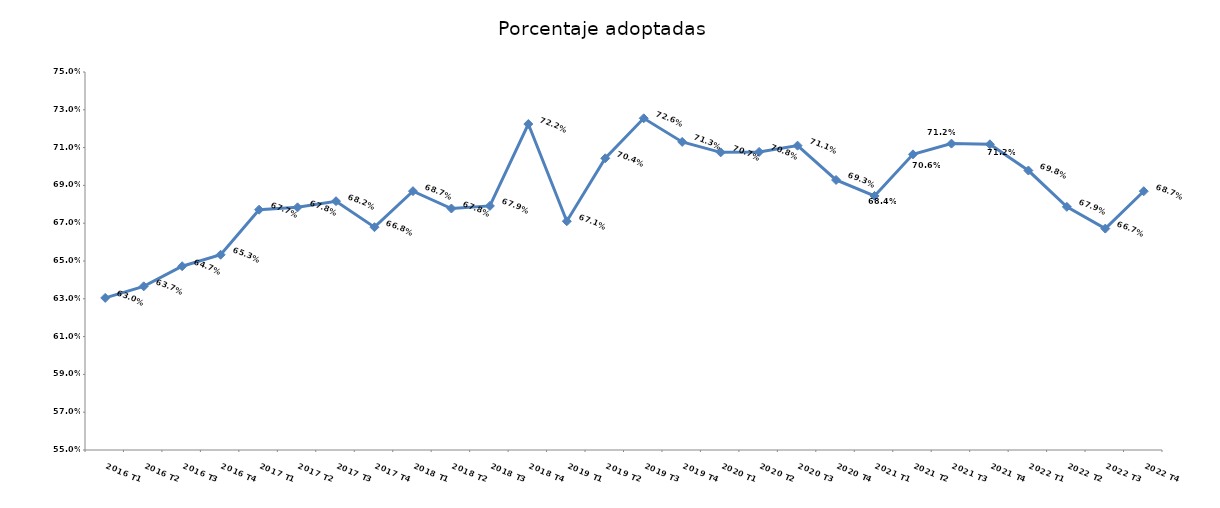
| Category | Porcentaje adoptadas |
|---|---|
| 2016 T1 | 0.63 |
| 2016 T2 | 0.637 |
| 2016 T3 | 0.647 |
| 2016 T4 | 0.653 |
| 2017 T1 | 0.677 |
| 2017 T2 | 0.678 |
| 2017 T3 | 0.682 |
| 2017 T4 | 0.668 |
| 2018 T1 | 0.687 |
| 2018 T2 | 0.678 |
| 2018 T3 | 0.679 |
| 2018 T4 | 0.722 |
| 2019 T1 | 0.671 |
| 2019 T2 | 0.704 |
| 2019 T3 | 0.726 |
| 2019 T4 | 0.713 |
| 2020 T1 | 0.707 |
| 2020 T2 | 0.708 |
| 2020 T3 | 0.711 |
| 2020 T4 | 0.693 |
| 2021 T1 | 0.684 |
| 2021 T2 | 0.706 |
| 2021 T3 | 0.712 |
| 2021 T4 | 0.712 |
| 2022 T1 | 0.698 |
| 2022 T2 | 0.679 |
| 2022 T3 | 0.667 |
| 2022 T4 | 0.687 |